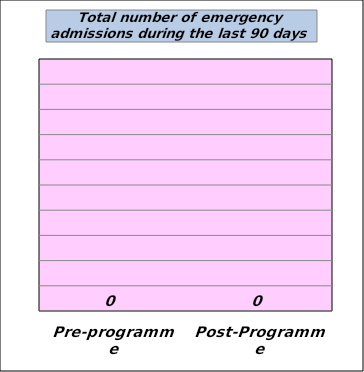
| Category | Series 0 |
|---|---|
| Pre-programme | 0 |
| Post-Programme | 0 |